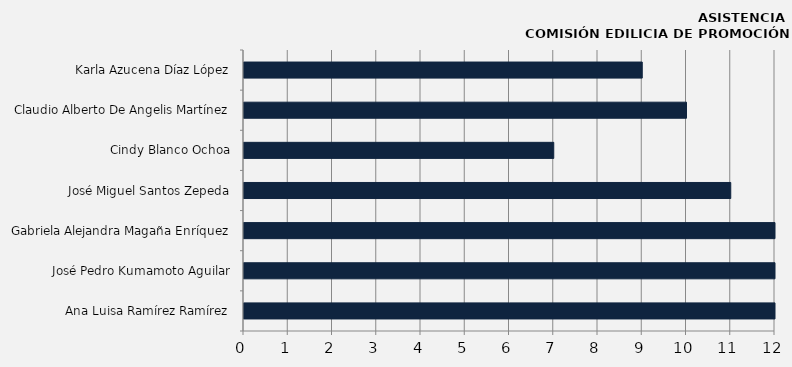
| Category | Ana Luisa Ramírez Ramírez |
|---|---|
| Ana Luisa Ramírez Ramírez | 12 |
| José Pedro Kumamoto Aguilar | 12 |
| Gabriela Alejandra Magaña Enríquez | 12 |
| José Miguel Santos Zepeda | 11 |
| Cindy Blanco Ochoa | 7 |
| Claudio Alberto De Angelis Martínez | 10 |
| Karla Azucena Díaz López | 9 |